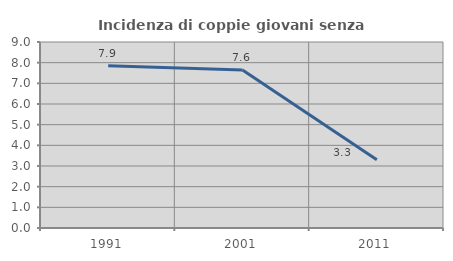
| Category | Incidenza di coppie giovani senza figli |
|---|---|
| 1991.0 | 7.853 |
| 2001.0 | 7.644 |
| 2011.0 | 3.303 |